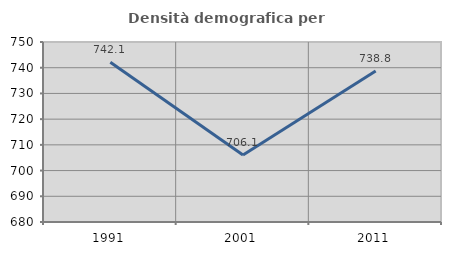
| Category | Densità demografica |
|---|---|
| 1991.0 | 742.136 |
| 2001.0 | 706.077 |
| 2011.0 | 738.757 |